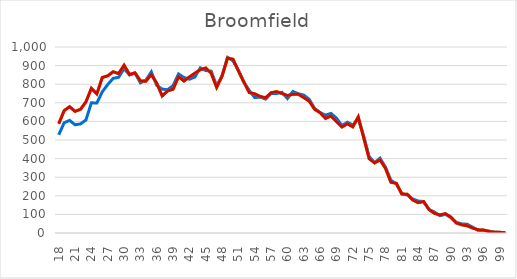
| Category | Series 0 | Adams |
|---|---|---|
| 18.0 | 528.096 | 587 |
| 19.0 | 592.74 | 658 |
| 20.0 | 605.49 | 679 |
| 21.0 | 581.809 | 654 |
| 22.0 | 586.401 | 665 |
| 23.0 | 607.815 | 705 |
| 24.0 | 700.074 | 778 |
| 25.0 | 698.508 | 748 |
| 26.0 | 759.184 | 836 |
| 27.0 | 798.4 | 845 |
| 28.0 | 831.25 | 867 |
| 29.0 | 837.23 | 857 |
| 30.0 | 884.096 | 902 |
| 31.0 | 849.245 | 852 |
| 32.0 | 860.629 | 861 |
| 33.0 | 807.148 | 818 |
| 34.0 | 821.26 | 816 |
| 35.0 | 866.051 | 852 |
| 36.0 | 793.524 | 805 |
| 37.0 | 773.663 | 737 |
| 38.0 | 770.278 | 764 |
| 39.0 | 792.437 | 773 |
| 40.0 | 854.954 | 840 |
| 41.0 | 836.151 | 817 |
| 42.0 | 826.914 | 839 |
| 43.0 | 838.71 | 859 |
| 44.0 | 887.845 | 878 |
| 45.0 | 873.462 | 887 |
| 46.0 | 870.128 | 859 |
| 47.0 | 790.889 | 783 |
| 48.0 | 846.475 | 844 |
| 49.0 | 943.921 | 941 |
| 50.0 | 925.703 | 934 |
| 51.0 | 873.583 | 872 |
| 52.0 | 810.514 | 811 |
| 53.0 | 766.106 | 755 |
| 54.0 | 728.217 | 748 |
| 55.0 | 730.594 | 734 |
| 56.0 | 720.068 | 727 |
| 57.0 | 750.629 | 754 |
| 58.0 | 750.083 | 760 |
| 59.0 | 756.077 | 750 |
| 60.0 | 722.976 | 739 |
| 61.0 | 760.764 | 746 |
| 62.0 | 748.857 | 746 |
| 63.0 | 741.343 | 728 |
| 64.0 | 718.574 | 709 |
| 65.0 | 669.354 | 665 |
| 66.0 | 647.175 | 647 |
| 67.0 | 633.256 | 616 |
| 68.0 | 642.94 | 630 |
| 69.0 | 617.397 | 599 |
| 70.0 | 577.656 | 570 |
| 71.0 | 595.228 | 587 |
| 72.0 | 580.693 | 571 |
| 73.0 | 613.959 | 624 |
| 74.0 | 521.161 | 513 |
| 75.0 | 411.32 | 400 |
| 76.0 | 378.381 | 377 |
| 77.0 | 402.007 | 393 |
| 78.0 | 354.34 | 348 |
| 79.0 | 283.519 | 273 |
| 80.0 | 263.622 | 267 |
| 81.0 | 210.987 | 210 |
| 82.0 | 204.13 | 208 |
| 83.0 | 182.912 | 178 |
| 84.0 | 171.744 | 163 |
| 85.0 | 169.429 | 169 |
| 86.0 | 126.821 | 126 |
| 87.0 | 112.411 | 106 |
| 88.0 | 92.973 | 97 |
| 89.0 | 100.41 | 104 |
| 90.0 | 82.426 | 86 |
| 91.0 | 57.045 | 54 |
| 92.0 | 49.067 | 44 |
| 93.0 | 46.753 | 39 |
| 94.0 | 31.847 | 27 |
| 95.0 | 14.272 | 17 |
| 96.0 | 14.651 | 16 |
| 97.0 | 10.52 | 8 |
| 98.0 | 4.938 | 4 |
| 99.0 | 2.822 | 4 |
| 100.0 | 3.401 | 1 |